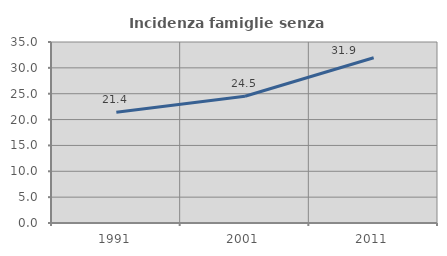
| Category | Incidenza famiglie senza nuclei |
|---|---|
| 1991.0 | 21.406 |
| 2001.0 | 24.516 |
| 2011.0 | 31.944 |